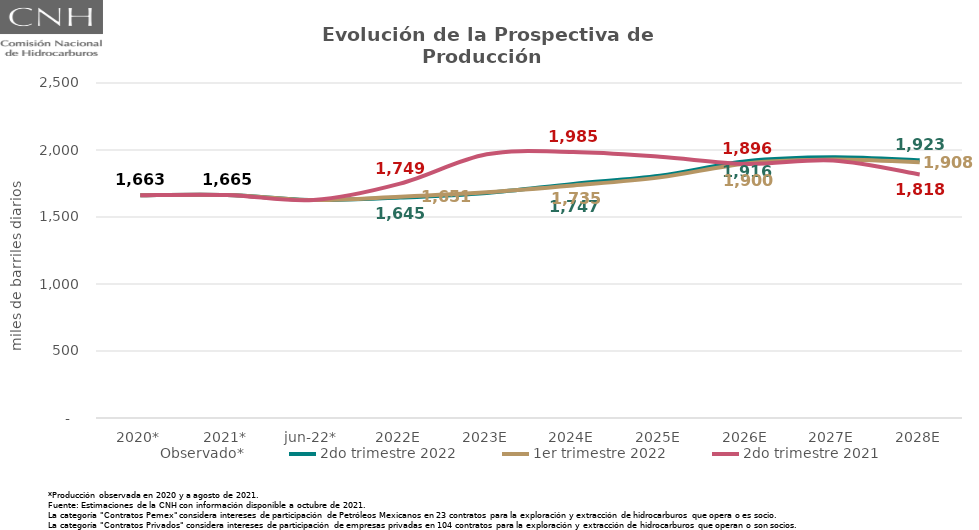
| Category | Observado* | 2do trimestre 2022 | 1er trimestre 2022 | 2do trimestre 2021 |
|---|---|---|---|---|
| 2020* | 1663.042 | 1663.042 | 1663.042 | 1663.042 |
| 2021* | 1664.708 | 1664.708 | 1664.708 | 1664.708 |
| jun-22* | 1626.428 | 1626.428 | 1626.428 | 1626.428 |
| 2022E | 1644.93 | 1644.93 | 1651.291 | 1748.577 |
| 2023E | 1679.08 | 1679.08 | 1684.624 | 1967.708 |
| 2024E | 1746.672 | 1746.672 | 1735.022 | 1984.972 |
| 2025E | 1807.591 | 1807.591 | 1795.75 | 1949.427 |
| 2026E | 1915.996 | 1915.996 | 1899.739 | 1895.673 |
| 2027E | 1945.473 | 1945.473 | 1928.439 | 1921.606 |
| 2028E | 1923.08 | 1923.08 | 1908.325 | 1817.618 |